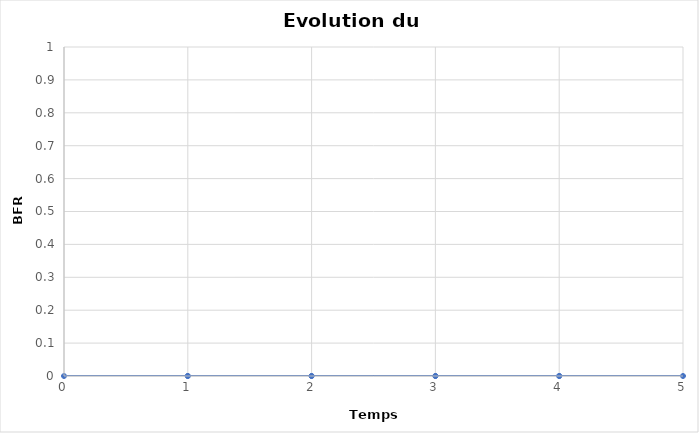
| Category | BFR |
|---|---|
| 0.0 | 0 |
| 1.0 | 0 |
| 1.0 | 0 |
| 2.0 | 0 |
| 2.0 | 0 |
| 3.0 | 0 |
| 3.0 | 0 |
| 4.0 | 0 |
| 4.0 | 0 |
| 5.0 | 0 |